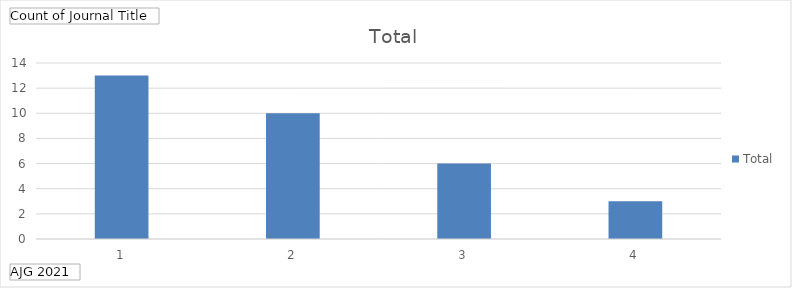
| Category | Total |
|---|---|
| 1 | 13 |
| 2 | 10 |
| 3 | 6 |
| 4 | 3 |